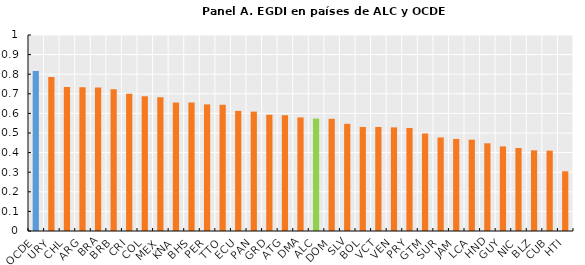
| Category | Series 0 |
|---|---|
| OCDE | 0.816 |
| URY | 0.786 |
| CHL | 0.735 |
| ARG | 0.734 |
| BRA | 0.733 |
| BRB | 0.723 |
| CRI | 0.7 |
| COL | 0.687 |
| MEX | 0.682 |
| KNA | 0.655 |
| BHS | 0.655 |
| PER | 0.646 |
| TTO | 0.644 |
| ECU | 0.613 |
| PAN | 0.609 |
| GRD | 0.593 |
| ATG | 0.591 |
| DMA | 0.579 |
| ALC | 0.574 |
| DOM | 0.573 |
| SLV | 0.547 |
| BOL | 0.531 |
| VCT | 0.531 |
| VEN | 0.529 |
| PRY | 0.526 |
| GTM | 0.497 |
| SUR | 0.477 |
| JAM | 0.47 |
| LCA | 0.466 |
| HND | 0.447 |
| GUY | 0.432 |
| NIC | 0.423 |
| BLZ | 0.412 |
| CUB | 0.41 |
| HTI | 0.305 |